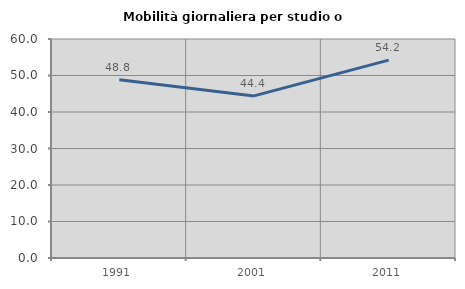
| Category | Mobilità giornaliera per studio o lavoro |
|---|---|
| 1991.0 | 48.828 |
| 2001.0 | 44.412 |
| 2011.0 | 54.206 |